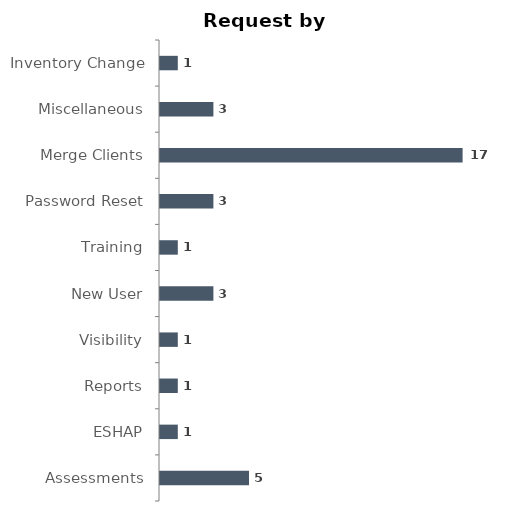
| Category | Total |
|---|---|
| Assessments | 5 |
| ESHAP | 1 |
| Reports | 1 |
| Visibility | 1 |
| New User | 3 |
| Training | 1 |
| Password Reset | 3 |
| Merge Clients | 17 |
| Miscellaneous | 3 |
| Inventory Change | 1 |